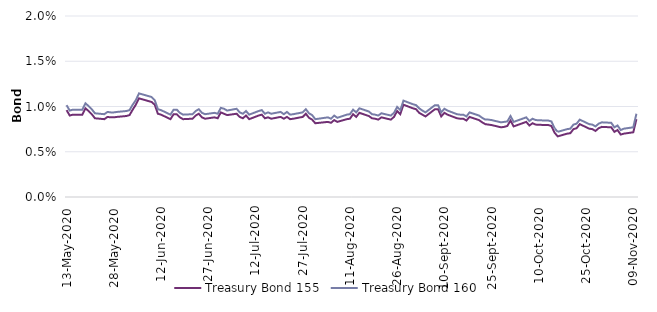
| Category | Treasury Bond 155 | Treasury Bond 160 |
|---|---|---|
| 2020-05-13 | 0.01 | 0.01 |
| 2020-05-14 | 0.009 | 0.01 |
| 2020-05-15 | 0.009 | 0.01 |
| 2020-05-18 | 0.009 | 0.01 |
| 2020-05-19 | 0.01 | 0.01 |
| 2020-05-20 | 0.01 | 0.01 |
| 2020-05-21 | 0.009 | 0.01 |
| 2020-05-22 | 0.009 | 0.009 |
| 2020-05-25 | 0.009 | 0.009 |
| 2020-05-26 | 0.009 | 0.009 |
| 2020-05-27 | 0.009 | 0.009 |
| 2020-05-28 | 0.009 | 0.009 |
| 2020-05-29 | 0.009 | 0.009 |
| 2020-06-01 | 0.009 | 0.01 |
| 2020-06-02 | 0.009 | 0.01 |
| 2020-06-03 | 0.01 | 0.01 |
| 2020-06-04 | 0.01 | 0.011 |
| 2020-06-05 | 0.011 | 0.011 |
| 2020-06-09 | 0.01 | 0.011 |
| 2020-06-10 | 0.01 | 0.011 |
| 2020-06-11 | 0.009 | 0.01 |
| 2020-06-12 | 0.009 | 0.01 |
| 2020-06-15 | 0.009 | 0.009 |
| 2020-06-16 | 0.009 | 0.01 |
| 2020-06-17 | 0.009 | 0.01 |
| 2020-06-18 | 0.009 | 0.009 |
| 2020-06-19 | 0.009 | 0.009 |
| 2020-06-22 | 0.009 | 0.009 |
| 2020-06-23 | 0.009 | 0.01 |
| 2020-06-24 | 0.009 | 0.01 |
| 2020-06-25 | 0.009 | 0.009 |
| 2020-06-26 | 0.009 | 0.009 |
| 2020-06-29 | 0.009 | 0.009 |
| 2020-06-30 | 0.009 | 0.009 |
| 2020-07-01 | 0.009 | 0.01 |
| 2020-07-02 | 0.009 | 0.01 |
| 2020-07-03 | 0.009 | 0.01 |
| 2020-07-06 | 0.009 | 0.01 |
| 2020-07-07 | 0.009 | 0.009 |
| 2020-07-08 | 0.009 | 0.009 |
| 2020-07-09 | 0.009 | 0.01 |
| 2020-07-10 | 0.009 | 0.009 |
| 2020-07-13 | 0.009 | 0.01 |
| 2020-07-14 | 0.009 | 0.01 |
| 2020-07-15 | 0.009 | 0.009 |
| 2020-07-16 | 0.009 | 0.009 |
| 2020-07-17 | 0.009 | 0.009 |
| 2020-07-20 | 0.009 | 0.009 |
| 2020-07-21 | 0.009 | 0.009 |
| 2020-07-22 | 0.009 | 0.009 |
| 2020-07-23 | 0.009 | 0.009 |
| 2020-07-24 | 0.009 | 0.009 |
| 2020-07-27 | 0.009 | 0.009 |
| 2020-07-28 | 0.009 | 0.01 |
| 2020-07-29 | 0.009 | 0.009 |
| 2020-07-30 | 0.009 | 0.009 |
| 2020-07-31 | 0.008 | 0.009 |
| 2020-08-04 | 0.008 | 0.009 |
| 2020-08-05 | 0.008 | 0.009 |
| 2020-08-06 | 0.008 | 0.009 |
| 2020-08-07 | 0.008 | 0.009 |
| 2020-08-10 | 0.009 | 0.009 |
| 2020-08-11 | 0.009 | 0.009 |
| 2020-08-12 | 0.009 | 0.01 |
| 2020-08-13 | 0.009 | 0.009 |
| 2020-08-14 | 0.009 | 0.01 |
| 2020-08-17 | 0.009 | 0.009 |
| 2020-08-18 | 0.009 | 0.009 |
| 2020-08-19 | 0.009 | 0.009 |
| 2020-08-20 | 0.009 | 0.009 |
| 2020-08-21 | 0.009 | 0.009 |
| 2020-08-24 | 0.009 | 0.009 |
| 2020-08-25 | 0.009 | 0.009 |
| 2020-08-26 | 0.01 | 0.01 |
| 2020-08-27 | 0.009 | 0.01 |
| 2020-08-28 | 0.01 | 0.011 |
| 2020-08-31 | 0.01 | 0.01 |
| 2020-09-01 | 0.01 | 0.01 |
| 2020-09-02 | 0.009 | 0.01 |
| 2020-09-03 | 0.009 | 0.01 |
| 2020-09-04 | 0.009 | 0.009 |
| 2020-09-07 | 0.01 | 0.01 |
| 2020-09-08 | 0.01 | 0.01 |
| 2020-09-09 | 0.009 | 0.009 |
| 2020-09-10 | 0.009 | 0.01 |
| 2020-09-11 | 0.009 | 0.01 |
| 2020-09-14 | 0.009 | 0.009 |
| 2020-09-15 | 0.009 | 0.009 |
| 2020-09-16 | 0.009 | 0.009 |
| 2020-09-17 | 0.008 | 0.009 |
| 2020-09-18 | 0.009 | 0.009 |
| 2020-09-21 | 0.008 | 0.009 |
| 2020-09-22 | 0.008 | 0.009 |
| 2020-09-23 | 0.008 | 0.009 |
| 2020-09-24 | 0.008 | 0.009 |
| 2020-09-25 | 0.008 | 0.008 |
| 2020-09-28 | 0.008 | 0.008 |
| 2020-09-29 | 0.008 | 0.008 |
| 2020-09-30 | 0.008 | 0.008 |
| 2020-10-01 | 0.008 | 0.009 |
| 2020-10-02 | 0.008 | 0.008 |
| 2020-10-06 | 0.008 | 0.009 |
| 2020-10-07 | 0.008 | 0.008 |
| 2020-10-08 | 0.008 | 0.009 |
| 2020-10-09 | 0.008 | 0.008 |
| 2020-10-12 | 0.008 | 0.008 |
| 2020-10-13 | 0.008 | 0.008 |
| 2020-10-14 | 0.008 | 0.008 |
| 2020-10-15 | 0.007 | 0.008 |
| 2020-10-16 | 0.007 | 0.007 |
| 2020-10-19 | 0.007 | 0.008 |
| 2020-10-20 | 0.007 | 0.008 |
| 2020-10-21 | 0.008 | 0.008 |
| 2020-10-22 | 0.008 | 0.008 |
| 2020-10-23 | 0.008 | 0.009 |
| 2020-10-26 | 0.008 | 0.008 |
| 2020-10-27 | 0.008 | 0.008 |
| 2020-10-28 | 0.007 | 0.008 |
| 2020-10-29 | 0.008 | 0.008 |
| 2020-10-30 | 0.008 | 0.008 |
| 2020-11-02 | 0.008 | 0.008 |
| 2020-11-03 | 0.007 | 0.008 |
| 2020-11-04 | 0.007 | 0.008 |
| 2020-11-05 | 0.007 | 0.007 |
| 2020-11-06 | 0.007 | 0.008 |
| 2020-11-09 | 0.007 | 0.008 |
| 2020-11-10 | 0.009 | 0.009 |